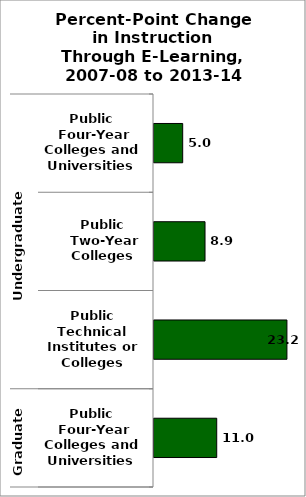
| Category | State |
|---|---|
| 0 | 5.016 |
| 1 | 8.919 |
| 2 | 23.238 |
| 3 | 10.965 |